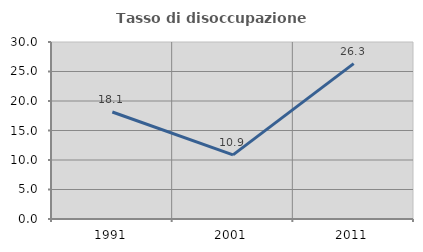
| Category | Tasso di disoccupazione giovanile  |
|---|---|
| 1991.0 | 18.138 |
| 2001.0 | 10.863 |
| 2011.0 | 26.341 |